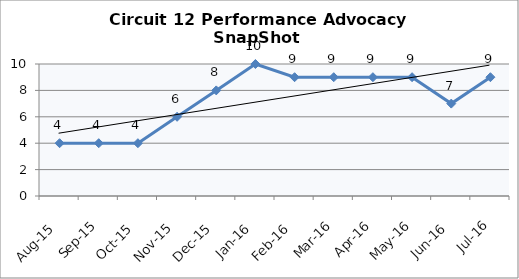
| Category | Circuit 12 |
|---|---|
| Aug-15 | 4 |
| Sep-15 | 4 |
| Oct-15 | 4 |
| Nov-15 | 6 |
| Dec-15 | 8 |
| Jan-16 | 10 |
| Feb-16 | 9 |
| Mar-16 | 9 |
| Apr-16 | 9 |
| May-16 | 9 |
| Jun-16 | 7 |
| Jul-16 | 9 |